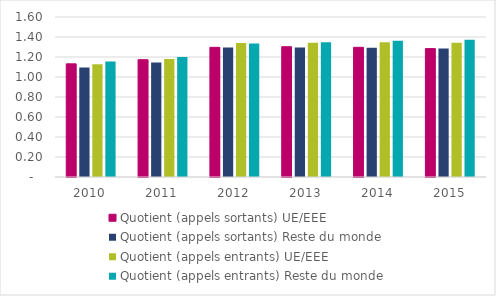
| Category | Quotient (appels sortants) UE/EEE | Quotient (appels sortants) Reste du monde | Quotient (appels entrants) UE/EEE | Quotient (appels entrants) Reste du monde |
|---|---|---|---|---|
| 2010.0 | 1.131 | 1.096 | 1.128 | 1.156 |
| 2011.0 | 1.173 | 1.146 | 1.18 | 1.2 |
| 2012.0 | 1.297 | 1.296 | 1.341 | 1.335 |
| 2013.0 | 1.303 | 1.295 | 1.342 | 1.348 |
| 2014.0 | 1.297 | 1.293 | 1.349 | 1.364 |
| 2015.0 | 1.284 | 1.285 | 1.341 | 1.372 |